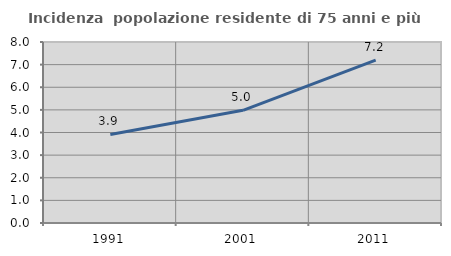
| Category | Incidenza  popolazione residente di 75 anni e più |
|---|---|
| 1991.0 | 3.914 |
| 2001.0 | 4.979 |
| 2011.0 | 7.195 |